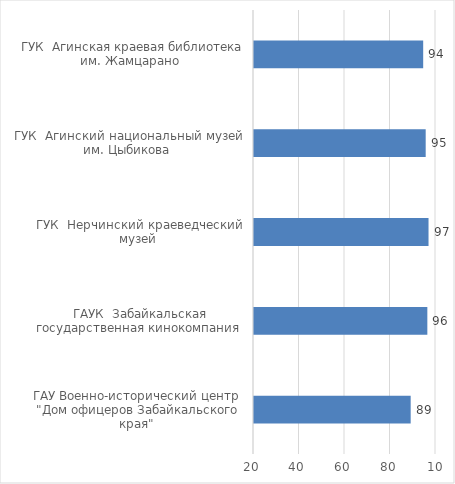
| Category | Series 0 |
|---|---|
| ГАУ Военно-исторический центр  "Дом офицеров Забайкальского края"  | 88.867 |
| ГАУК  Забайкальская государственная кинокомпания  | 96.194 |
| ГУК  Нерчинский краеведческий музей  | 96.716 |
| ГУК  Агинский национальный музей им. Цыбикова  | 95.469 |
| ГУК  Агинская краевая библиотека им. Жамцарано  | 94.368 |